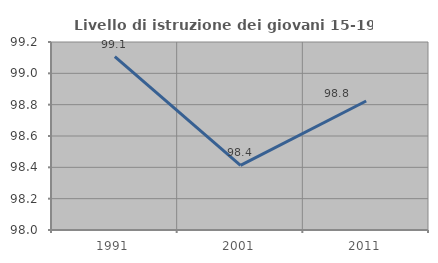
| Category | Livello di istruzione dei giovani 15-19 anni |
|---|---|
| 1991.0 | 99.107 |
| 2001.0 | 98.413 |
| 2011.0 | 98.824 |